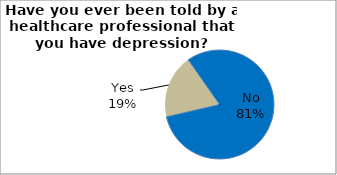
| Category | Series 0 |
|---|---|
| No | 81.09 |
| Yes | 18.91 |